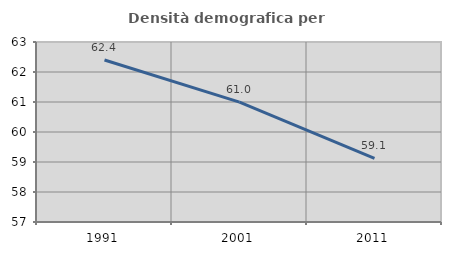
| Category | Densità demografica |
|---|---|
| 1991.0 | 62.4 |
| 2001.0 | 60.994 |
| 2011.0 | 59.119 |